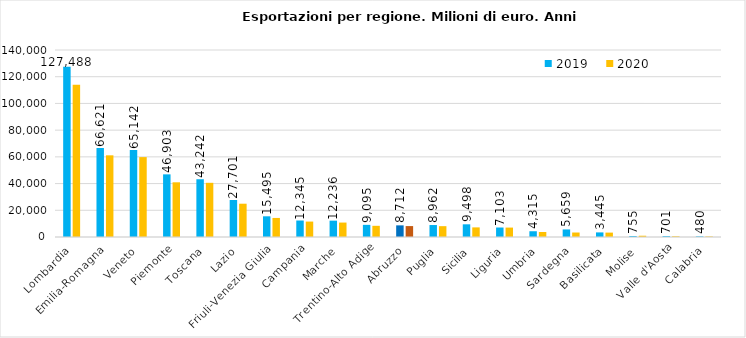
| Category | 2019 | 2020 |
|---|---|---|
| Lombardia | 127487.881 | 114021.793 |
| Emilia-Romagna | 66620.61 | 61147.983 |
| Veneto | 65142.117 | 59812.317 |
| Piemonte | 46903.24 | 40950.538 |
| Toscana | 43242.302 | 40571.609 |
| Lazio | 27701.326 | 24923.859 |
| Friuli-Venezia Giulia | 15495.463 | 14267.556 |
| Campania | 12344.556 | 11551.14 |
| Marche | 12235.788 | 10809.316 |
| Trentino-Alto Adige | 9095.021 | 8372.449 |
| Abruzzo | 8712.361 | 8170.924 |
| Puglia | 8961.752 | 8117.27 |
| Sicilia | 9498.395 | 7195.159 |
| Liguria | 7103.291 | 7051.433 |
| Umbria | 4315.251 | 3762.039 |
| Sardegna | 5659.355 | 3359.658 |
| Basilicata | 3445.143 | 3294.094 |
| Molise | 754.639 | 950.747 |
| Valle d'Aosta | 701.252 | 563.458 |
| Calabria | 479.814 | 401.853 |